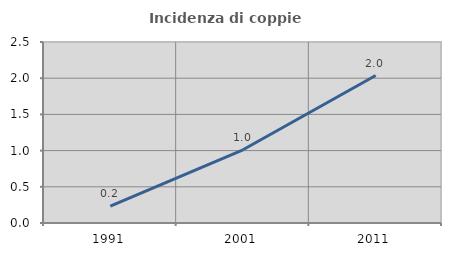
| Category | Incidenza di coppie miste |
|---|---|
| 1991.0 | 0.232 |
| 2001.0 | 1.012 |
| 2011.0 | 2.037 |